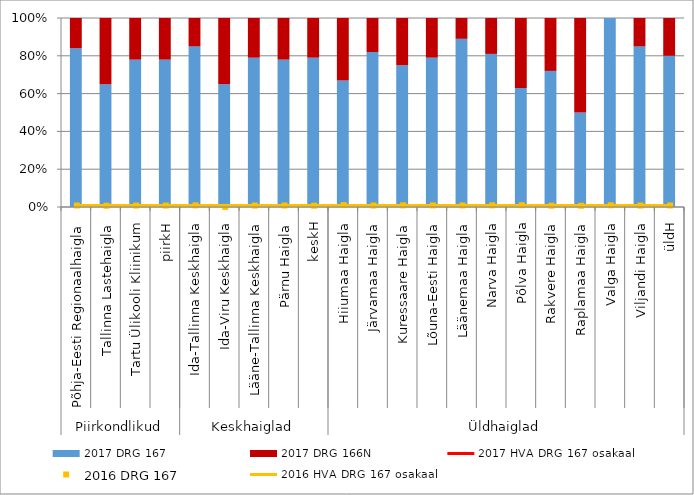
| Category | 2017 DRG 167 | 2017 DRG 166N |
|---|---|---|
| 0 | 0.84 | 0.16 |
| 1 | 0.65 | 0.35 |
| 2 | 0.78 | 0.22 |
| 3 | 0.78 | 0.22 |
| 4 | 0.85 | 0.15 |
| 5 | 0.65 | 0.35 |
| 6 | 0.79 | 0.21 |
| 7 | 0.78 | 0.22 |
| 8 | 0.79 | 0.21 |
| 9 | 0.67 | 0.33 |
| 10 | 0.82 | 0.18 |
| 11 | 0.75 | 0.25 |
| 12 | 0.79 | 0.21 |
| 13 | 0.89 | 0.11 |
| 14 | 0.81 | 0.19 |
| 15 | 0.63 | 0.37 |
| 16 | 0.72 | 0.28 |
| 17 | 0.5 | 0.5 |
| 18 | 1 | 0 |
| 19 | 0.85 | 0.15 |
| 20 | 0.8 | 0.2 |